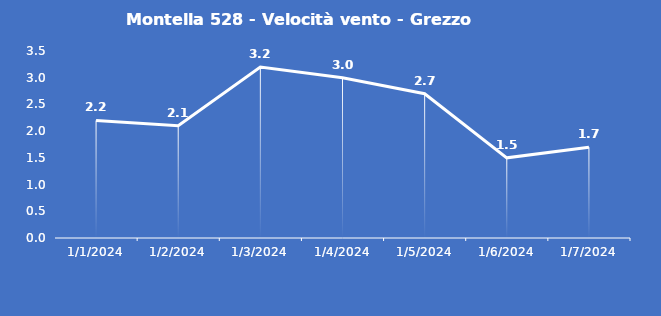
| Category | Montella 528 - Velocità vento - Grezzo (m/s) |
|---|---|
| 1/1/24 | 2.2 |
| 1/2/24 | 2.1 |
| 1/3/24 | 3.2 |
| 1/4/24 | 3 |
| 1/5/24 | 2.7 |
| 1/6/24 | 1.5 |
| 1/7/24 | 1.7 |